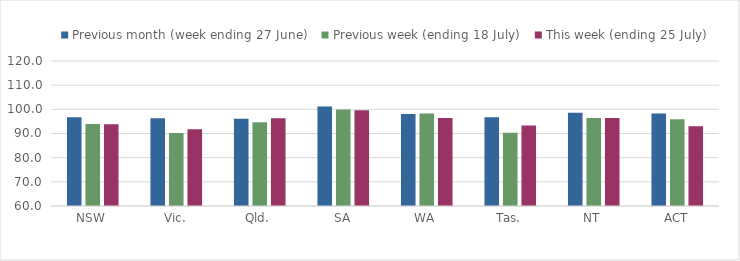
| Category | Previous month (week ending 27 June) | Previous week (ending 18 July) | This week (ending 25 July) |
|---|---|---|---|
| NSW | 96.763 | 93.884 | 93.819 |
| Vic. | 96.36 | 90.251 | 91.743 |
| Qld. | 96.142 | 94.633 | 96.265 |
| SA | 101.222 | 99.94 | 99.584 |
| WA | 98.023 | 98.265 | 96.436 |
| Tas. | 96.684 | 90.304 | 93.285 |
| NT | 98.586 | 96.384 | 96.434 |
| ACT | 98.249 | 95.867 | 92.998 |